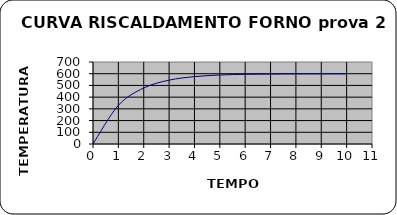
| Category | Series 0 |
|---|---|
| 0.0 | 0 |
| 1.0 | 330 |
| 2.0 | 478 |
| 3.0 | 545 |
| 4.0 | 575 |
| 5.0 | 589 |
| 6.0 | 595 |
| 7.0 | 597 |
| 8.0 | 599 |
| 9.0 | 599 |
| 10.0 | 599 |